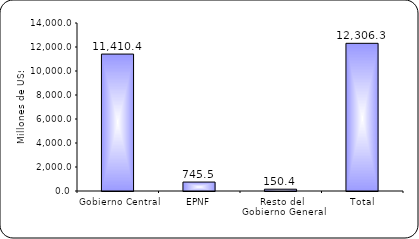
| Category | Series 1 |
|---|---|
| Gobierno Central | 11410.4 |
| EPNF | 745.5 |
| Resto del Gobierno General | 150.4 |
| Total | 12306.3 |